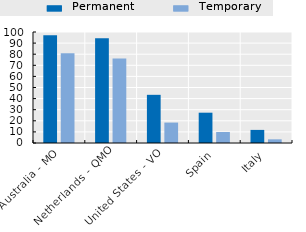
| Category | Permanent | Temporary |
|---|---|---|
| Australia - MO | 97.1 | 80.8 |
| Netherlands - QMO | 94.4 | 76.2 |
| United States - VO | 43.4 | 18.4 |
| Spain | 27.3 | 9.9 |
| Italy | 11.8 | 3.3 |